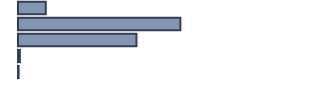
| Category | Series 0 |
|---|---|
| 0 | 8.9 |
| 1 | 52.2 |
| 2 | 38.1 |
| 3 | 0.6 |
| 4 | 0.2 |